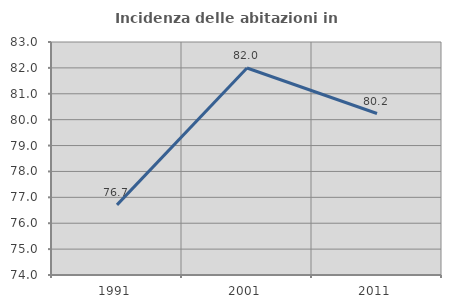
| Category | Incidenza delle abitazioni in proprietà  |
|---|---|
| 1991.0 | 76.708 |
| 2001.0 | 81.994 |
| 2011.0 | 80.238 |